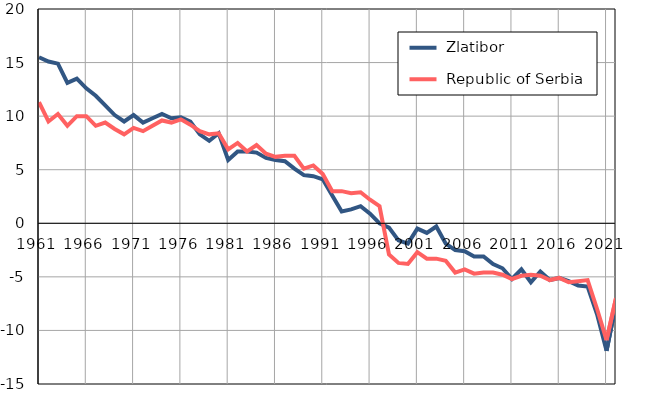
| Category |  Zlatibor |  Republic of Serbia |
|---|---|---|
| 1961.0 | 15.5 | 11.3 |
| 1962.0 | 15.1 | 9.5 |
| 1963.0 | 14.9 | 10.2 |
| 1964.0 | 13.1 | 9.1 |
| 1965.0 | 13.5 | 10 |
| 1966.0 | 12.6 | 10 |
| 1967.0 | 11.9 | 9.1 |
| 1968.0 | 11 | 9.4 |
| 1969.0 | 10.1 | 8.8 |
| 1970.0 | 9.5 | 8.3 |
| 1971.0 | 10.1 | 8.9 |
| 1972.0 | 9.4 | 8.6 |
| 1973.0 | 9.8 | 9.1 |
| 1974.0 | 10.2 | 9.6 |
| 1975.0 | 9.8 | 9.4 |
| 1976.0 | 9.9 | 9.7 |
| 1977.0 | 9.5 | 9.2 |
| 1978.0 | 8.3 | 8.6 |
| 1979.0 | 7.7 | 8.3 |
| 1980.0 | 8.4 | 8.4 |
| 1981.0 | 5.9 | 6.9 |
| 1982.0 | 6.7 | 7.5 |
| 1983.0 | 6.7 | 6.7 |
| 1984.0 | 6.6 | 7.3 |
| 1985.0 | 6.1 | 6.5 |
| 1986.0 | 5.9 | 6.2 |
| 1987.0 | 5.8 | 6.3 |
| 1988.0 | 5.1 | 6.3 |
| 1989.0 | 4.5 | 5.1 |
| 1990.0 | 4.4 | 5.4 |
| 1991.0 | 4.1 | 4.6 |
| 1992.0 | 2.6 | 3 |
| 1993.0 | 1.1 | 3 |
| 1994.0 | 1.3 | 2.8 |
| 1995.0 | 1.6 | 2.9 |
| 1996.0 | 0.9 | 2.2 |
| 1997.0 | 0 | 1.6 |
| 1998.0 | -0.4 | -2.9 |
| 1999.0 | -1.6 | -3.7 |
| 2000.0 | -1.9 | -3.8 |
| 2001.0 | -0.5 | -2.7 |
| 2002.0 | -0.9 | -3.3 |
| 2003.0 | -0.3 | -3.3 |
| 2004.0 | -1.9 | -3.5 |
| 2005.0 | -2.5 | -4.6 |
| 2006.0 | -2.6 | -4.3 |
| 2007.0 | -3.1 | -4.7 |
| 2008.0 | -3.1 | -4.6 |
| 2009.0 | -3.8 | -4.6 |
| 2010.0 | -4.2 | -4.8 |
| 2011.0 | -5.2 | -5.2 |
| 2012.0 | -4.3 | -4.9 |
| 2013.0 | -5.5 | -4.8 |
| 2014.0 | -4.5 | -4.9 |
| 2015.0 | -5.3 | -5.3 |
| 2016.0 | -5.1 | -5.1 |
| 2017.0 | -5.4 | -5.5 |
| 2018.0 | -5.8 | -5.4 |
| 2019.0 | -5.9 | -5.3 |
| 2020.0 | -8.5 | -8 |
| 2021.0 | -11.9 | -10.9 |
| 2022.0 | -7.5 | -7 |